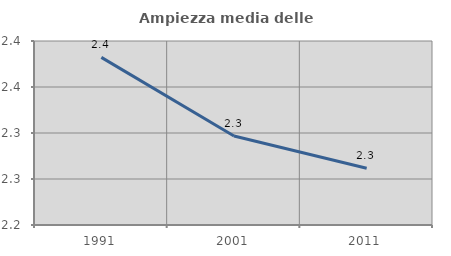
| Category | Ampiezza media delle famiglie |
|---|---|
| 1991.0 | 2.382 |
| 2001.0 | 2.297 |
| 2011.0 | 2.262 |